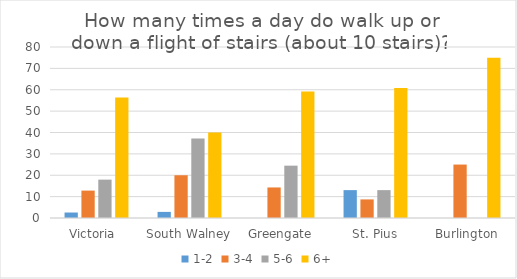
| Category | 1-2 | 3-4 | 5-6 | 6+ |
|---|---|---|---|---|
| Victoria  | 2.564 | 12.821 | 17.949 | 56.41 |
| South Walney | 2.857 | 20 | 37.143 | 40 |
| Greengate | 0 | 14.286 | 24.49 | 59.184 |
| St. Pius | 13.043 | 8.696 | 13.043 | 60.87 |
| Burlington | 0 | 25 | 0 | 75 |